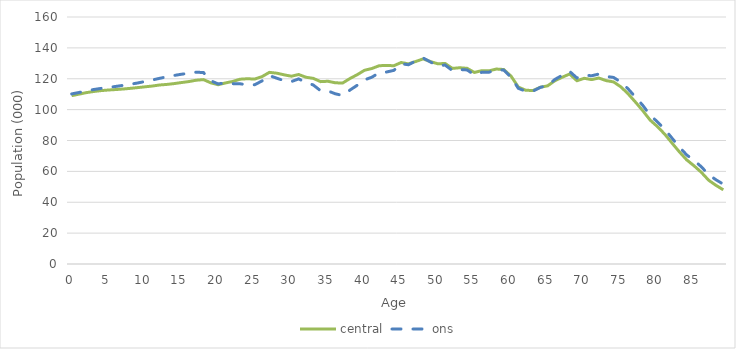
| Category | central | ons |
|---|---|---|
| 0.0 | 109.026 | 110.177 |
| 1.0 | 110.033 | 111.097 |
| 2.0 | 111 | 112.137 |
| 3.0 | 111.745 | 113.018 |
| 4.0 | 112.304 | 113.744 |
| 5.0 | 112.7 | 114.386 |
| 6.0 | 112.995 | 115.013 |
| 7.0 | 113.345 | 115.684 |
| 8.0 | 113.77 | 116.441 |
| 9.0 | 114.262 | 117.234 |
| 10.0 | 114.765 | 118.214 |
| 11.0 | 115.272 | 119.194 |
| 12.0 | 115.956 | 120.256 |
| 13.0 | 116.329 | 121.258 |
| 14.0 | 116.858 | 122.137 |
| 15.0 | 117.545 | 122.925 |
| 16.0 | 118.17 | 123.567 |
| 17.0 | 119.039 | 124.247 |
| 18.0 | 119.44 | 124.012 |
| 19.0 | 117.375 | 118.71 |
| 20.0 | 116.136 | 116.659 |
| 21.0 | 117.271 | 117.36 |
| 22.0 | 118.266 | 116.796 |
| 23.0 | 119.712 | 116.733 |
| 24.0 | 120.001 | 116.01 |
| 25.0 | 119.807 | 116.101 |
| 26.0 | 121.374 | 118.613 |
| 27.0 | 124.138 | 122.074 |
| 28.0 | 123.614 | 120.378 |
| 29.0 | 122.558 | 118.736 |
| 30.0 | 121.634 | 118.175 |
| 31.0 | 122.752 | 119.893 |
| 32.0 | 120.982 | 117.587 |
| 33.0 | 120.247 | 115.95 |
| 34.0 | 118.123 | 112.217 |
| 35.0 | 118.373 | 112.125 |
| 36.0 | 117.389 | 110.259 |
| 37.0 | 117.211 | 109.176 |
| 38.0 | 120.127 | 112.635 |
| 39.0 | 122.639 | 115.771 |
| 40.0 | 125.5 | 119.288 |
| 41.0 | 126.634 | 121.007 |
| 42.0 | 128.438 | 123.901 |
| 43.0 | 128.63 | 124.354 |
| 44.0 | 128.431 | 125.43 |
| 45.0 | 130.521 | 129.693 |
| 46.0 | 129.649 | 129.067 |
| 47.0 | 131.18 | 131.574 |
| 48.0 | 132.859 | 133.46 |
| 49.0 | 131.13 | 130.85 |
| 50.0 | 129.696 | 128.513 |
| 51.0 | 129.894 | 128.872 |
| 52.0 | 126.699 | 125.274 |
| 53.0 | 127.128 | 125.927 |
| 54.0 | 126.758 | 125.711 |
| 55.0 | 124.084 | 122.529 |
| 56.0 | 125.235 | 124.178 |
| 57.0 | 125.122 | 124.223 |
| 58.0 | 126.29 | 125.809 |
| 59.0 | 125.988 | 125.637 |
| 60.0 | 121.741 | 121.009 |
| 61.0 | 114.6 | 113.792 |
| 62.0 | 112.573 | 111.92 |
| 63.0 | 112.343 | 111.983 |
| 64.0 | 114.494 | 114.407 |
| 65.0 | 115.405 | 115.572 |
| 66.0 | 118.738 | 119.575 |
| 67.0 | 120.98 | 122.246 |
| 68.0 | 123.052 | 124.789 |
| 69.0 | 118.732 | 120.513 |
| 70.0 | 120.297 | 122.363 |
| 71.0 | 119.455 | 121.92 |
| 72.0 | 120.46 | 123.05 |
| 73.0 | 118.778 | 121.476 |
| 74.0 | 117.968 | 120.868 |
| 75.0 | 114.767 | 117.859 |
| 76.0 | 110.212 | 113.396 |
| 77.0 | 104.87 | 108.12 |
| 78.0 | 99.291 | 102.756 |
| 79.0 | 93.236 | 96.38 |
| 80.0 | 88.996 | 92.083 |
| 81.0 | 84.072 | 87.244 |
| 82.0 | 78.289 | 81.476 |
| 83.0 | 72.614 | 75.74 |
| 84.0 | 67.43 | 70.609 |
| 85.0 | 63.603 | 67.067 |
| 86.0 | 59.359 | 62.968 |
| 87.0 | 54.244 | 57.814 |
| 88.0 | 50.93 | 54.534 |
| 89.0 | 48.038 | 51.69 |